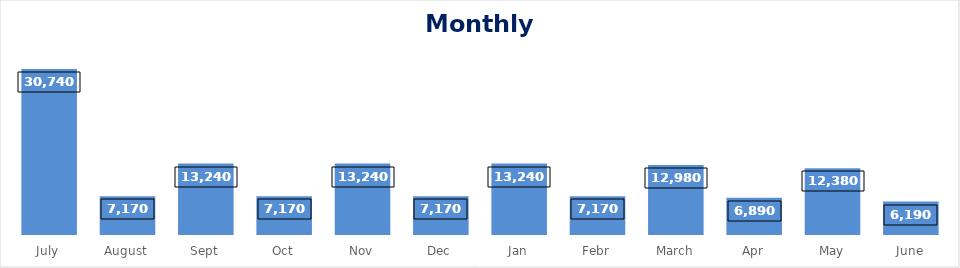
| Category | Series 0 |
|---|---|
| July | 30740.1 |
| August | 7170.05 |
| Sept | 13240.1 |
| Oct | 7170.05 |
| Nov | 13240.1 |
| Dec | 7170.05 |
| Jan | 13240.1 |
| Febr | 7170.05 |
| March | 12980.02 |
| Apr | 6890.01 |
| May | 12380.02 |
| June | 6190.01 |